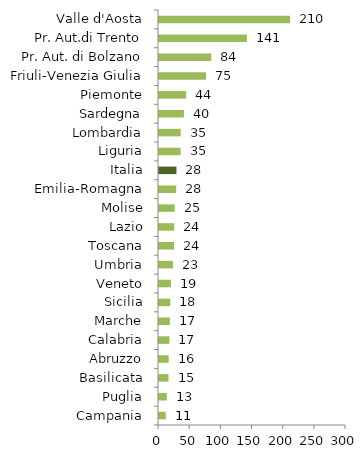
| Category | Series 0 |
|---|---|
| Campania | 10.967 |
| Puglia | 12.579 |
| Basilicata | 15.289 |
| Abruzzo | 15.61 |
| Calabria | 16.777 |
| Marche | 17.469 |
| Sicilia | 18.126 |
| Veneto | 19.105 |
| Umbria | 22.572 |
| Toscana | 24.18 |
| Lazio | 24.384 |
| Molise | 25.174 |
| Emilia-Romagna | 27.595 |
| Italia | 28 |
| Liguria | 34.578 |
| Lombardia | 34.841 |
| Sardegna | 39.961 |
| Piemonte | 43.557 |
| Friuli-Venezia Giulia | 75.39 |
| Pr. Aut. di Bolzano | 83.892 |
| Pr. Aut.di Trento | 141.063 |
| Valle d'Aosta | 210.29 |